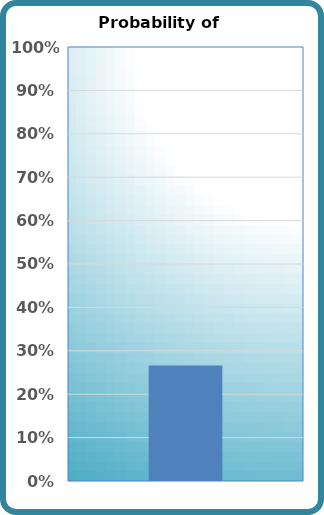
| Category | Probability of Success |
|---|---|
| 0 | 0.266 |